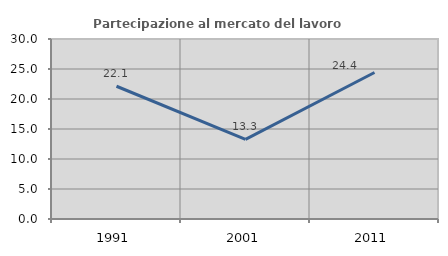
| Category | Partecipazione al mercato del lavoro  femminile |
|---|---|
| 1991.0 | 22.124 |
| 2001.0 | 13.265 |
| 2011.0 | 24.419 |